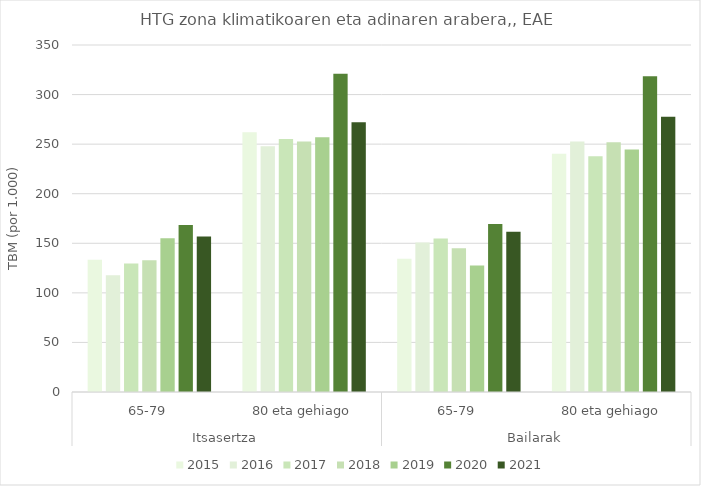
| Category | 2015 | 2016 | 2017 | 2018 | 2019 | 2020 | 2021 |
|---|---|---|---|---|---|---|---|
| 0 | 133.333 | 117.834 | 129.561 | 132.944 | 155.16 | 168.39 | 156.863 |
| 1 | 262.099 | 247.753 | 255.097 | 252.562 | 256.957 | 320.944 | 272.011 |
| 2 | 134.387 | 150.745 | 154.799 | 144.953 | 127.553 | 169.434 | 161.685 |
| 3 | 240.379 | 252.627 | 237.876 | 251.93 | 244.531 | 318.53 | 277.738 |